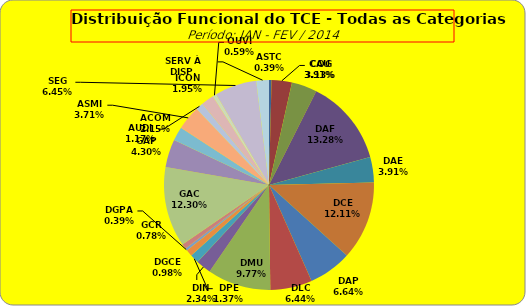
| Category | ASTC COG CAU DAF DAE DCE DAP DLC DMU DIN DPE DGCE DGPA GCR GAC GAP ACOM ASMI AUDI ICON OUVI SEG SERV À DISP. |
|---|---|
| ASTC | 2 |
| COG | 16 |
| CAU | 20 |
| DAF | 68 |
| DAE | 20 |
| DCE | 62 |
| DAP | 34 |
| DLC | 33 |
| DMU | 50 |
| DIN | 12 |
| DPE | 7 |
| DGCE | 5 |
| DGPA | 2 |
| GCR | 4 |
| GAC | 63 |
| GAP | 22 |
| ACOM | 11 |
| ASMI | 19 |
| AUDI | 6 |
| ICON | 10 |
| OUVI | 3 |
| SEG | 33 |
| SERV À DISP. | 10 |